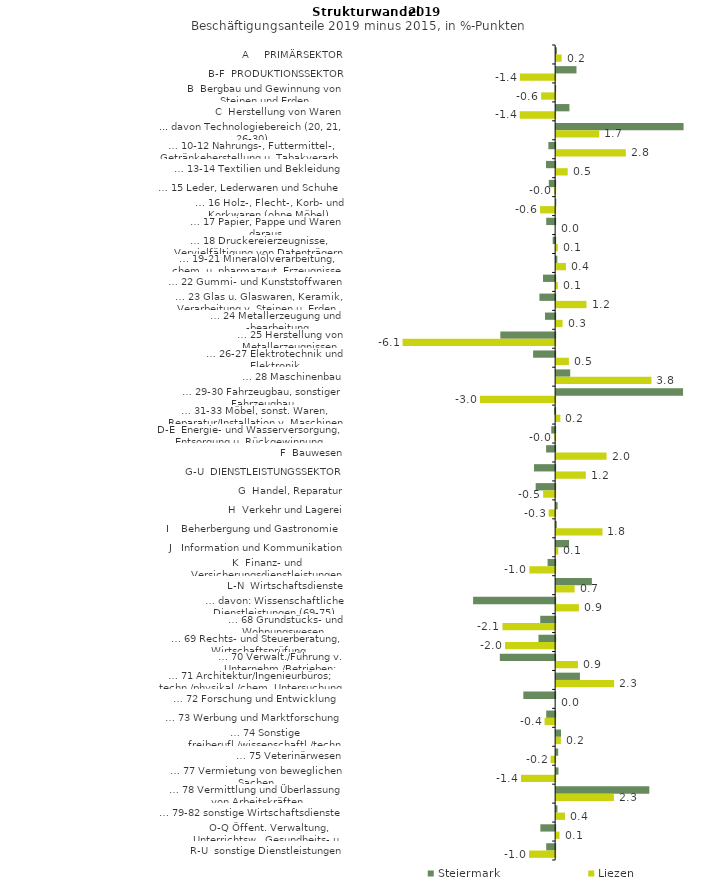
| Category | Steiermark | Liezen |
|---|---|---|
| A     PRIMÄRSEKTOR | 0.031 | 0.22 |
| B-F  PRODUKTIONSSEKTOR | 0.809 | -1.402 |
| B  Bergbau und Gewinnung von Steinen und Erden | -0.014 | -0.557 |
| C  Herstellung von Waren | 0.528 | -1.408 |
| ... davon Technologiebereich (20, 21, 26-30) | 5.068 | 1.714 |
| … 10-12 Nahrungs-, Futtermittel-, Getränkeherstellung u. Tabakverarb. | -0.269 | 2.771 |
| … 13-14 Textilien und Bekleidung | -0.363 | 0.46 |
| … 15 Leder, Lederwaren und Schuhe | -0.253 | -0.042 |
| … 16 Holz-, Flecht-, Korb- und Korkwaren (ohne Möbel)  | 0.005 | -0.599 |
| … 17 Papier, Pappe und Waren daraus  | -0.355 | 0 |
| … 18 Druckereierzeugnisse, Vervielfältigung von Datenträgern | -0.098 | 0.066 |
| … 19-21 Mineralölverarbeitung, chem. u. pharmazeut. Erzeugnisse | 0.048 | 0.39 |
| … 22 Gummi- und Kunststoffwaren | -0.484 | 0.066 |
| … 23 Glas u. Glaswaren, Keramik, Verarbeitung v. Steinen u. Erden  | -0.625 | 1.207 |
| … 24 Metallerzeugung und -bearbeitung | -0.403 | 0.256 |
| … 25 Herstellung von Metallerzeugnissen  | -2.18 | -6.068 |
| … 26-27 Elektrotechnik und Elektronik | -0.876 | 0.508 |
| … 28 Maschinenbau | 0.559 | 3.79 |
| … 29-30 Fahrzeugbau, sonstiger Fahrzeugbau | 5.047 | -2.989 |
| … 31-33 Möbel, sonst. Waren, Reparatur/Installation v. Maschinen | -0.041 | 0.167 |
| D-E  Energie- und Wasserversorgung, Entsorgung u. Rückgewinnung | -0.153 | -0.03 |
| F  Bauwesen | -0.36 | 2.005 |
| G-U  DIENSTLEISTUNGSSEKTOR | -0.84 | 1.181 |
| G  Handel, Reparatur | -0.775 | -0.477 |
| H  Verkehr und Lagerei | 0.059 | -0.26 |
| I    Beherbergung und Gastronomie | 0.026 | 1.843 |
| J   Information und Kommunikation | 0.514 | 0.086 |
| K  Finanz- und Versicherungsdienstleistungen | -0.301 | -1.025 |
| L-N  Wirtschaftsdienste | 1.421 | 0.736 |
| … davon: Wissenschaftliche Dienstleistungen (69-75) | -3.263 | 0.905 |
| … 68 Grundstücks- und Wohnungswesen  | -0.593 | -2.094 |
| … 69 Rechts- und Steuerberatung, Wirtschaftsprüfung | -0.663 | -1.992 |
| … 70 Verwalt./Führung v. Unternehm./Betrieben; Unternehmensberat. | -2.199 | 0.865 |
| … 71 Architektur/Ingenieurbüros; techn./physikal./chem. Untersuchung | 0.947 | 2.306 |
| … 72 Forschung und Entwicklung  | -1.265 | 0 |
| … 73 Werbung und Marktforschung | -0.356 | -0.42 |
| … 74 Sonstige freiberufl./wissenschaftl./techn. Tätigkeiten | 0.194 | 0.188 |
| … 75 Veterinärwesen | 0.081 | -0.18 |
| … 77 Vermietung von beweglichen Sachen  | 0.093 | -1.357 |
| … 78 Vermittlung und Überlassung von Arbeitskräften | 3.706 | 2.297 |
| … 79-82 sonstige Wirtschaftsdienste | 0.053 | 0.351 |
| O-Q Öffent. Verwaltung, Unterrichtsw., Gesundheits- u. Sozialwesen | -0.588 | 0.134 |
| R-U  sonstige Dienstleistungen | -0.356 | -1.037 |